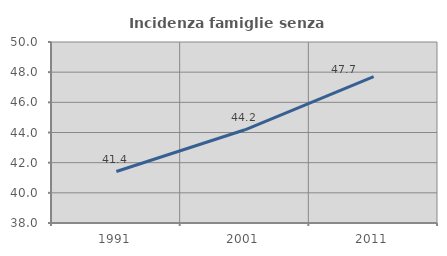
| Category | Incidenza famiglie senza nuclei |
|---|---|
| 1991.0 | 41.412 |
| 2001.0 | 44.179 |
| 2011.0 | 47.697 |